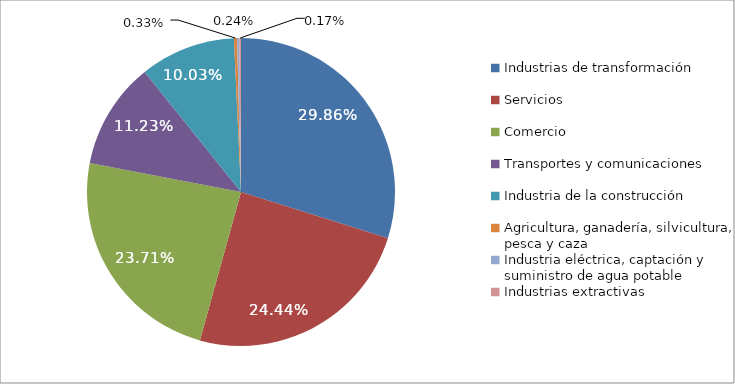
| Category | Series 0 |
|---|---|
| Industrias de transformación | 33362 |
| Servicios | 27314 |
| Comercio | 26497 |
| Transportes y comunicaciones | 12542 |
| Industria de la construcción | 11207 |
| Agricultura, ganadería, silvicultura, pesca y caza | 365 |
| Industria eléctrica, captación y suministro de agua potable | 262 |
| Industrias extractivas | 191 |